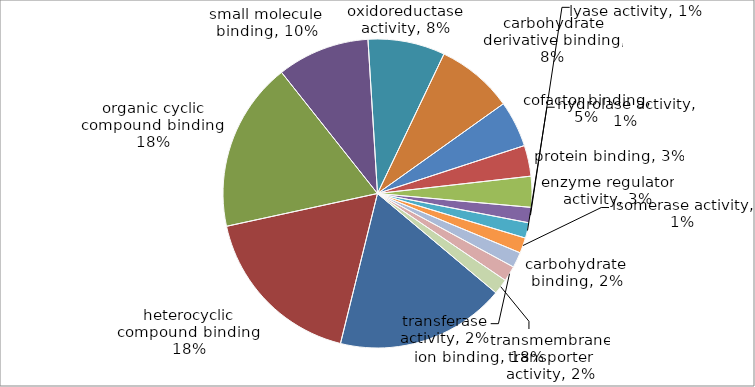
| Category | Series 0 |
|---|---|
| ion binding | 11 |
| heterocyclic compound binding | 11 |
| organic cyclic compound binding | 11 |
| small molecule binding | 6 |
| oxidoreductase activity | 5 |
| carbohydrate derivative binding | 5 |
| cofactor binding | 3 |
| protein binding | 2 |
| enzyme regulator activity | 2 |
| lyase activity | 1 |
| hydrolase activity | 1 |
| isomerase activity | 1 |
| carbohydrate binding | 1 |
| transferase activity | 1 |
| transmembrane transporter activity | 1 |